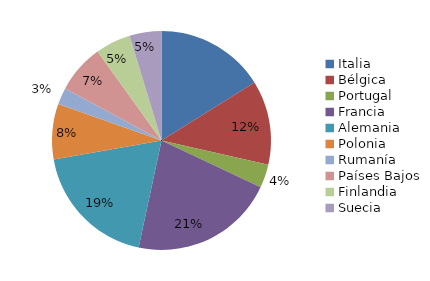
| Category | Series 0 |
|---|---|
| Italia | 65 |
| Bélgica | 50 |
| Portugal | 14 |
| Francia | 86 |
| Alemania | 76 |
| Polonia | 33 |
| Rumanía | 10 |
| Países Bajos | 29 |
| Finlandia | 21 |
| Suecia | 19 |